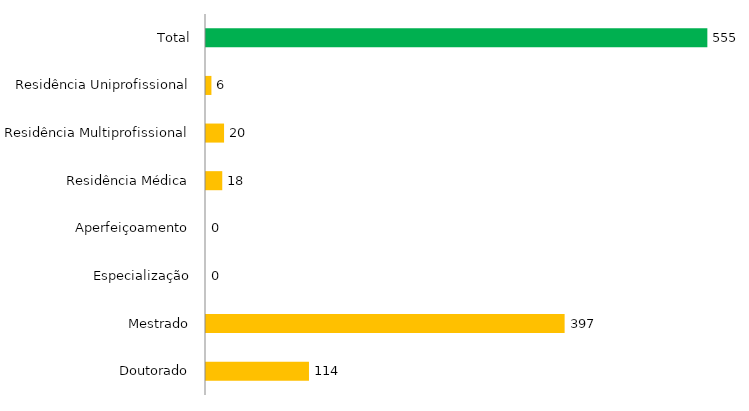
| Category | Pós - Graduação UFGD |
|---|---|
| Doutorado | 114 |
| Mestrado | 397 |
| Especialização | 0 |
| Aperfeiçoamento | 0 |
| Residência Médica | 18 |
| Residência Multiprofissional | 20 |
| Residência Uniprofissional | 6 |
| Total | 555 |